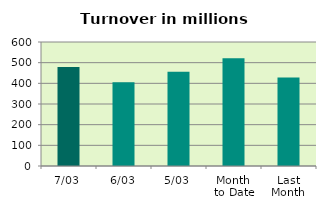
| Category | Series 0 |
|---|---|
| 7/03 | 478.608 |
| 6/03 | 405.714 |
| 5/03 | 455.85 |
| Month 
to Date | 521.246 |
| Last
Month | 428.598 |